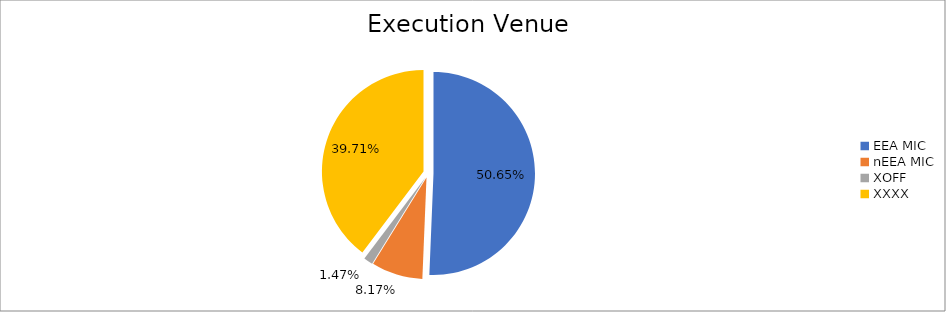
| Category | Series 0 |
|---|---|
| EEA MIC | 6738166.47 |
| nEEA MIC | 1086226.455 |
| XOFF | 195672.135 |
| XXXX | 5282989.6 |